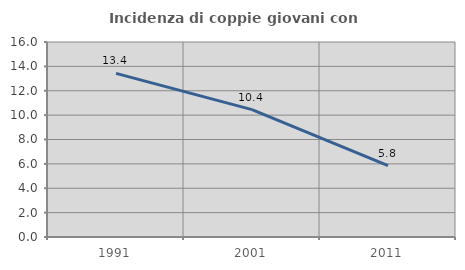
| Category | Incidenza di coppie giovani con figli |
|---|---|
| 1991.0 | 13.426 |
| 2001.0 | 10.448 |
| 2011.0 | 5.848 |